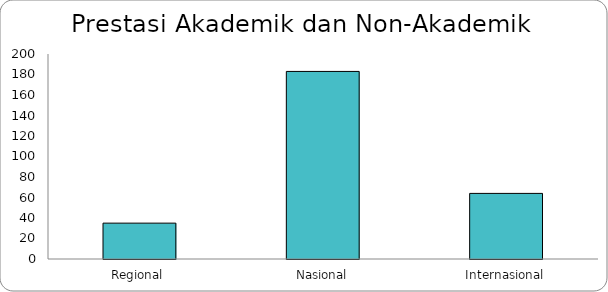
| Category | Series 0 |
|---|---|
| Regional | 35 |
| Nasional | 183 |
| Internasional | 64 |